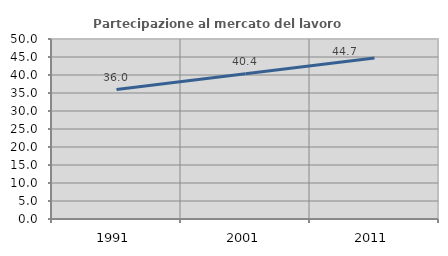
| Category | Partecipazione al mercato del lavoro  femminile |
|---|---|
| 1991.0 | 35.955 |
| 2001.0 | 40.351 |
| 2011.0 | 44.706 |